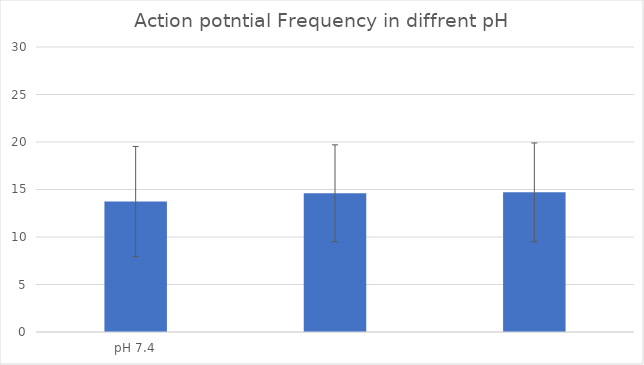
| Category | Series 0 |
|---|---|
| pH 7.4 | 13.73 |
|  | 14.6 |
|  | 14.7 |